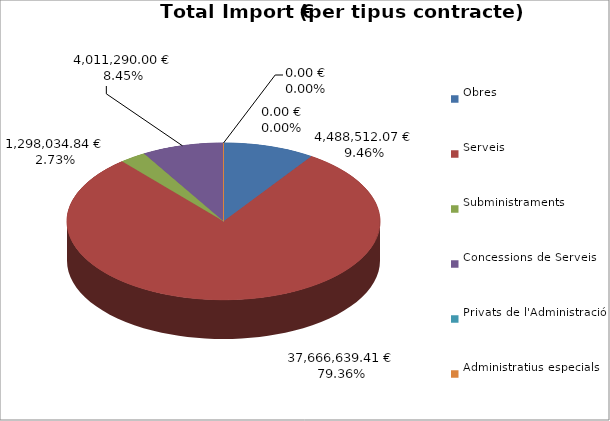
| Category | Total preu
(amb IVA) |
|---|---|
| Obres | 4488512.073 |
| Serveis | 37666639.407 |
| Subministraments | 1298034.845 |
| Concessions de Serveis | 4011289.997 |
| Privats de l'Administració | 0 |
| Administratius especials | 0 |